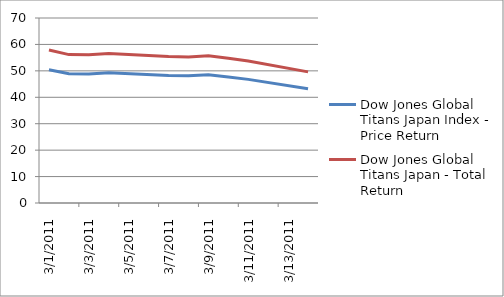
| Category | Dow Jones Global Titans Japan Index - Price Return | Dow Jones Global Titans Japan - Total Return |
|---|---|---|
| 01/03/2011 | 50.389 | 57.878 |
| 02/03/2011 | 48.887 | 56.153 |
| 03/03/2011 | 48.846 | 56.105 |
| 04/03/2011 | 49.26 | 56.581 |
| 07/03/2011 | 48.237 | 55.405 |
| 08/03/2011 | 48.123 | 55.274 |
| 09/03/2011 | 48.481 | 55.687 |
| 10/03/2011 | 47.666 | 54.751 |
| 11/03/2011 | 46.779 | 53.731 |
| 14/03/2011 | 43.194 | 49.613 |